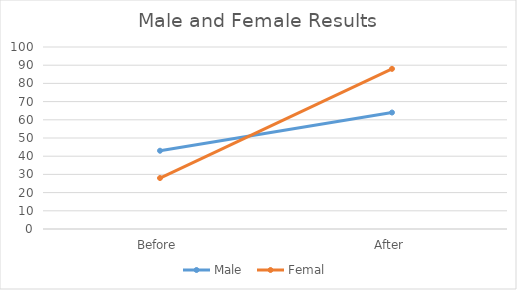
| Category | Male  | Femal  |
|---|---|---|
| Before | 43 | 28 |
| After | 64 | 88 |